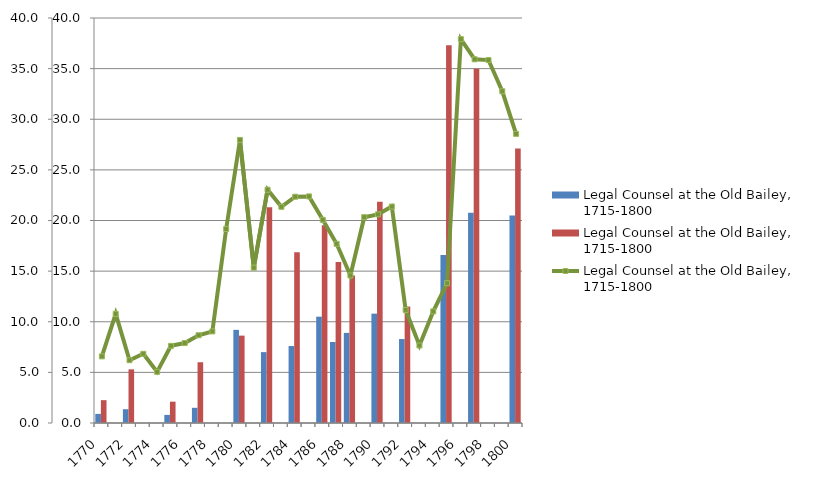
| Category | Legal Counsel at the Old Bailey, 1715-1800 |
|---|---|
| 1770 | 2.256 |
| 1771 | 0 |
| 1772 | 5.3 |
| 1773 | 0 |
| 1774 | 0 |
| 1775 | 2.107 |
| 1776 | 0 |
| 1777 | 6 |
| 1778 | 0 |
| 1779 | 0 |
| 1780 | 8.63 |
| 1781 | 0 |
| 1782 | 21.3 |
| 1783 | 0 |
| 1784 | 16.856 |
| 1785 | 0 |
| 1786 | 19.528 |
| 1787 | 15.9 |
| 1788 | 14.575 |
| 1789 | 0 |
| 1790 | 21.853 |
| 1791 | 0 |
| 1792 | 11.5 |
| 1793 | 0 |
| 1794 | 0 |
| 1795 | 37.313 |
| 1796 | 0 |
| 1797 | 35 |
| 1798 | 0 |
| 1799 | 0 |
| 1800 | 27.121 |